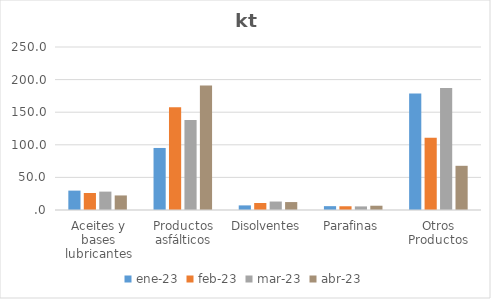
| Category | ene-23 | feb-23 | mar-23 | abr-23 |
|---|---|---|---|---|
| Aceites y bases lubricantes | 29.736 | 26.083 | 28.197 | 22.325 |
| Productos asfálticos | 95.146 | 157.779 | 137.849 | 190.78 |
| Disolventes | 7.066 | 10.742 | 12.987 | 12.172 |
| Parafinas | 5.911 | 5.736 | 5.512 | 6.554 |
| Otros Productos | 178.734 | 110.852 | 187.207 | 67.786 |